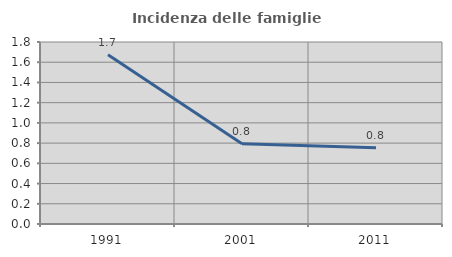
| Category | Incidenza delle famiglie numerose |
|---|---|
| 1991.0 | 1.673 |
| 2001.0 | 0.794 |
| 2011.0 | 0.754 |